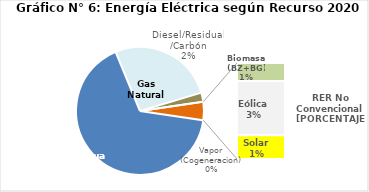
| Category | Series 0 |
|---|---|
| Agua | 3150.111 |
| Gas Natural | 1261.328 |
| Diesel/Residual/Carbón | 109.165 |
| Vapor (Cogeneracion) | 0.275 |
| Biomasa (BZ+BG) | 41.03 |
| Eólica | 124.323 |
| Solar | 54.235 |